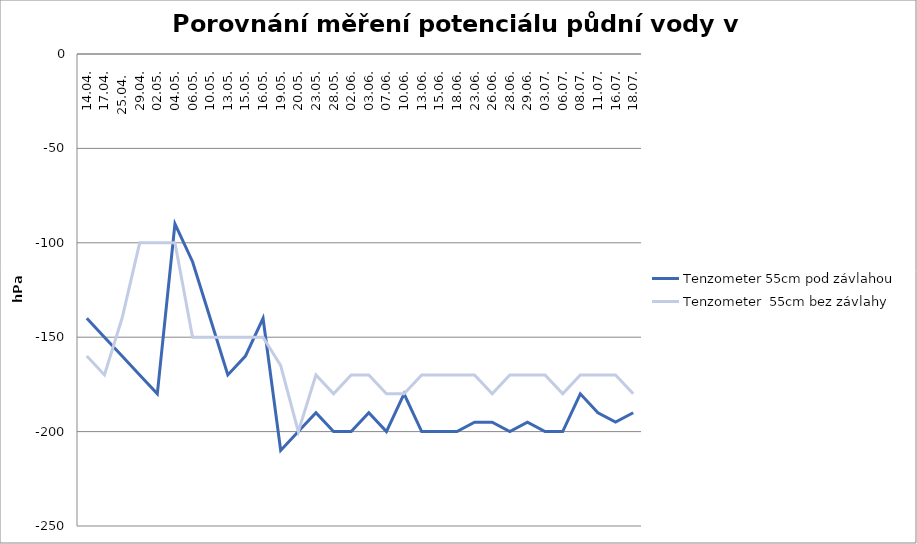
| Category | Tenzometer 2 - 25cm | Průměr tenzometer 25cm pod závlahou | Tenzometer 55cm pod závlahou | Tenzometer 1 - 25cm | Průměr tenzometer 25cm bez závlahy | Tenzometer  55cm bez závlahy |
|---|---|---|---|---|---|---|
| 14.04. |  |  | -140 |  |  | -160 |
| 17.04. |  |  | -150 |  |  | -170 |
| 25.04.  |  |  | -160 |  |  | -140 |
| 29.04. |  |  | -170 |  |  | -100 |
| 02.05. |  |  | -180 |  |  | -100 |
| 04.05. |  |  | -90 |  |  | -100 |
| 06.05. |  |  | -110 |  |  | -150 |
| 10.05. |  |  | -140 |  |  | -150 |
| 13.05. |  |  | -170 |  |  | -150 |
| 15.05. |  |  | -160 |  |  | -150 |
| 16.05. |  |  | -140 |  |  | -150 |
| 19.05. |  |  | -210 |  |  | -165 |
| 20.05. |  |  | -200 |  |  | -200 |
| 23.05. |  |  | -190 |  |  | -170 |
| 28.05. |  |  | -200 |  |  | -180 |
| 02.06. |  |  | -200 |  |  | -170 |
| 03.06. |  |  | -190 |  |  | -170 |
| 07.06. |  |  | -200 |  |  | -180 |
| 10.06. |  |  | -180 |  |  | -180 |
| 13.06. |  |  | -200 |  |  | -170 |
| 15.06. |  |  | -200 |  |  | -170 |
| 18.06. |  |  | -200 |  |  | -170 |
| 23.06. |  |  | -195 |  |  | -170 |
| 26.06. |  |  | -195 |  |  | -180 |
| 28.06. |  |  | -200 |  |  | -170 |
| 29.06. |  |  | -195 |  |  | -170 |
| 03.07. |  |  | -200 |  |  | -170 |
| 06.07. |  |  | -200 |  |  | -180 |
| 08.07. |  |  | -180 |  |  | -170 |
| 11.07. |  |  | -190 |  |  | -170 |
| 16.07. |  |  | -195 |  |  | -170 |
| 18.07. |  |  | -190 |  |  | -180 |